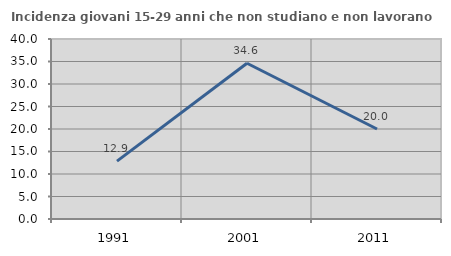
| Category | Incidenza giovani 15-29 anni che non studiano e non lavorano  |
|---|---|
| 1991.0 | 12.855 |
| 2001.0 | 34.615 |
| 2011.0 | 20 |